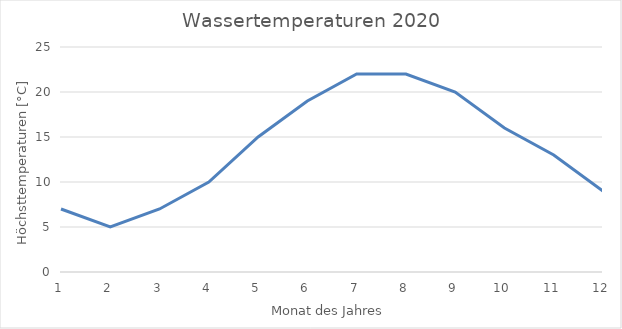
| Category | Series 0 |
|---|---|
| 0 | 7 |
| 1 | 5 |
| 2 | 7 |
| 3 | 10 |
| 4 | 15 |
| 5 | 19 |
| 6 | 22 |
| 7 | 22 |
| 8 | 20 |
| 9 | 16 |
| 10 | 13 |
| 11 | 9 |